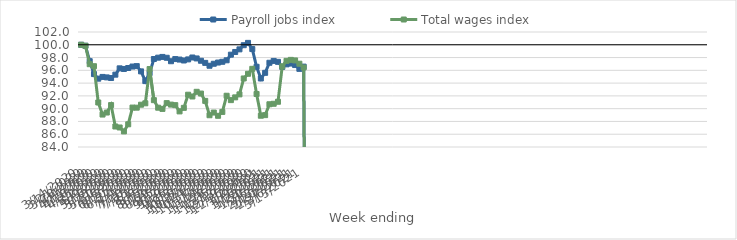
| Category | Payroll jobs index | Total wages index |
|---|---|---|
| 14/03/2020 | 100 | 100 |
| 21/03/2020 | 99.849 | 99.838 |
| 28/03/2020 | 97.434 | 96.96 |
| 04/04/2020 | 95.413 | 96.647 |
| 11/04/2020 | 94.696 | 90.967 |
| 18/04/2020 | 94.969 | 89.079 |
| 25/04/2020 | 94.894 | 89.393 |
| 02/05/2020 | 94.796 | 90.56 |
| 09/05/2020 | 95.321 | 87.207 |
| 16/05/2020 | 96.311 | 87.055 |
| 23/05/2020 | 96.216 | 86.439 |
| 30/05/2020 | 96.364 | 87.555 |
| 06/06/2020 | 96.594 | 90.172 |
| 13/06/2020 | 96.659 | 90.157 |
| 20/06/2020 | 95.837 | 90.62 |
| 27/06/2020 | 94.313 | 90.839 |
| 04/07/2020 | 95.565 | 96.2 |
| 11/07/2020 | 97.773 | 91.331 |
| 18/07/2020 | 97.984 | 90.152 |
| 25/07/2020 | 98.098 | 89.964 |
| 01/08/2020 | 97.965 | 90.87 |
| 08/08/2020 | 97.424 | 90.638 |
| 15/08/2020 | 97.762 | 90.551 |
| 22/08/2020 | 97.685 | 89.572 |
| 29/08/2020 | 97.54 | 90.127 |
| 05/09/2020 | 97.712 | 92.185 |
| 12/09/2020 | 98.009 | 91.907 |
| 19/09/2020 | 97.86 | 92.639 |
| 26/09/2020 | 97.499 | 92.365 |
| 03/10/2020 | 97.165 | 91.216 |
| 10/10/2020 | 96.72 | 88.97 |
| 17/10/2020 | 97.03 | 89.392 |
| 24/10/2020 | 97.218 | 88.884 |
| 31/10/2020 | 97.338 | 89.492 |
| 07/11/2020 | 97.571 | 92.02 |
| 14/11/2020 | 98.449 | 91.335 |
| 21/11/2020 | 98.874 | 91.768 |
| 28/11/2020 | 99.285 | 92.237 |
| 05/12/2020 | 99.933 | 94.727 |
| 12/12/2020 | 100.299 | 95.46 |
| 19/12/2020 | 99.328 | 96.235 |
| 26/12/2020 | 96.554 | 92.3 |
| 02/01/2021 | 94.723 | 88.895 |
| 09/01/2021 | 95.608 | 88.987 |
| 16/01/2021 | 97.183 | 90.691 |
| 23/01/2021 | 97.475 | 90.766 |
| 30/01/2021 | 97.328 | 91.08 |
| 06/02/2021 | 96.534 | 96.627 |
| 13/02/2021 | 96.937 | 97.481 |
| 20/02/2021 | 97.061 | 97.638 |
| 27/02/2021 | 96.828 | 97.55 |
| 06/03/2021 | 96.232 | 97.036 |
| 13/03/2021 | 96.582 | 96.443 |